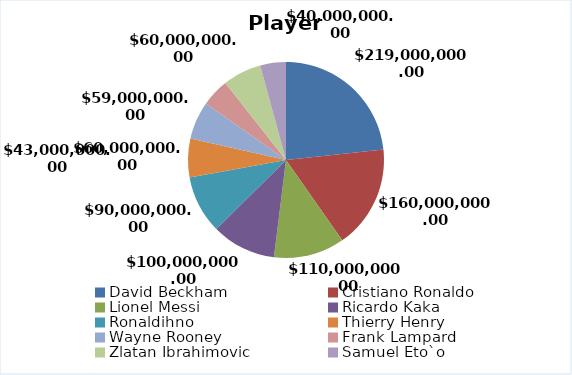
| Category | Value |
|---|---|
| David Beckham | 219000000 |
| Cristiano Ronaldo | 160000000 |
| Lionel Messi | 110000000 |
| Ricardo Kaka | 100000000 |
| Ronaldihno | 90000000 |
| Thierry Henry | 60000000 |
| Wayne Rooney | 59000000 |
| Frank Lampard | 43000000 |
| Zlatan Ibrahimovic | 60000000 |
| Samuel Eto`o | 40000000 |